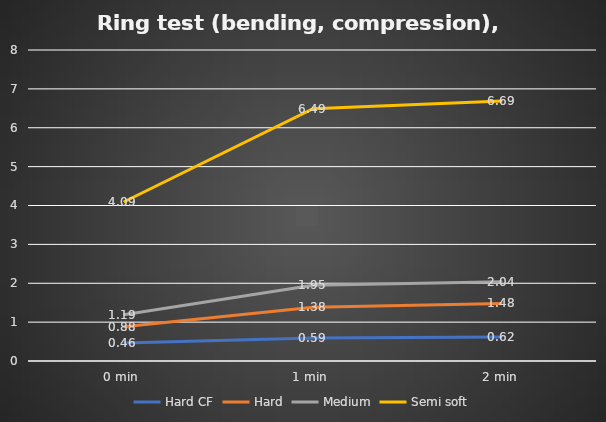
| Category | Hard CF | Hard | Medium | Semi soft |
|---|---|---|---|---|
| 0 min | 0.46 | 0.88 | 1.19 | 4.09 |
| 1 min | 0.59 | 1.38 | 1.95 | 6.49 |
| 2 min | 0.62 | 1.48 | 2.04 | 6.69 |